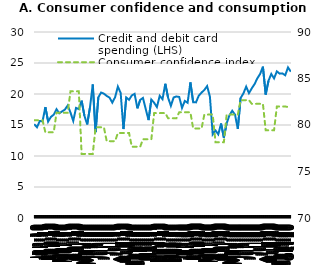
| Category | Credit and debit card spending (LHS) |
|---|---|
| 2019-01-04 | 15.138 |
| 2019-01-11 | 14.633 |
| 2019-01-18 | 15.64 |
| 2019-01-25 | 15.604 |
| 2019-02-01 | 17.898 |
| 2019-02-08 | 15.553 |
| 2019-02-15 | 16.305 |
| 2019-02-22 | 16.664 |
| 2019-03-01 | 17.551 |
| 2019-03-08 | 16.892 |
| 2019-03-15 | 17.191 |
| 2019-03-22 | 17.485 |
| 2019-03-29 | 18.14 |
| 2019-04-05 | 17.017 |
| 2019-04-12 | 15.656 |
| 2019-04-19 | 17.755 |
| 2019-04-26 | 17.567 |
| 2019-05-03 | 18.926 |
| 2019-05-10 | 16.505 |
| 2019-05-17 | 15.093 |
| 2019-05-24 | 17.843 |
| 2019-05-31 | 21.543 |
| 2019-06-07 | 13.849 |
| 2019-06-14 | 19.471 |
| 2019-06-21 | 20.238 |
| 2019-06-28 | 20.05 |
| 2019-07-05 | 19.69 |
| 2019-07-12 | 19.422 |
| 2019-07-19 | 18.61 |
| 2019-07-26 | 19.473 |
| 2019-08-02 | 21.196 |
| 2019-08-09 | 20.164 |
| 2019-08-16 | 14.348 |
| 2019-08-23 | 19.438 |
| 2019-08-30 | 19.063 |
| 2019-09-06 | 19.771 |
| 2019-09-13 | 20.018 |
| 2019-09-20 | 17.69 |
| 2019-09-27 | 19.044 |
| 2019-10-04 | 19.368 |
| 2019-10-11 | 17.548 |
| 2019-10-18 | 15.789 |
| 2019-10-25 | 19.097 |
| 2019-11-01 | 18.584 |
| 2019-11-08 | 17.895 |
| 2019-11-15 | 19.706 |
| 2019-11-22 | 19.162 |
| 2019-11-29 | 21.65 |
| 2019-12-06 | 19.408 |
| 2019-12-13 | 18.093 |
| 2019-12-20 | 19.447 |
| 2019-12-27 | 19.601 |
| 2020-01-03 | 19.516 |
| 2020-01-10 | 17.752 |
| 2020-01-17 | 18.883 |
| 2020-01-24 | 18.589 |
| 2020-01-31 | 21.869 |
| 2020-02-07 | 18.674 |
| 2020-02-14 | 18.65 |
| 2020-02-21 | 19.723 |
| 2020-02-28 | 20.231 |
| 2020-03-06 | 20.65 |
| 2020-03-13 | 21.272 |
| 2020-03-20 | 19.569 |
| 2020-03-27 | 13.498 |
| 2020-04-03 | 14.123 |
| 2020-04-10 | 13.489 |
| 2020-04-17 | 15.236 |
| 2020-04-24 | 12.966 |
| 2020-05-01 | 15.263 |
| 2020-05-08 | 16.559 |
| 2020-05-15 | 17.297 |
| 2020-05-22 | 16.672 |
| 2020-05-29 | 14.365 |
| 2020-06-05 | 19.349 |
| 2020-06-12 | 20.088 |
| 2020-06-19 | 21.188 |
| 2020-06-26 | 20.137 |
| 2020-07-03 | 20.908 |
| 2020-07-10 | 21.585 |
| 2020-07-17 | 22.525 |
| 2020-07-24 | 23.232 |
| 2020-07-31 | 24.409 |
| 2020-08-07 | 19.909 |
| 2020-08-14 | 22.133 |
| 2020-08-21 | 23.233 |
| 2020-08-28 | 22.51 |
| 2020-09-04 | 23.65 |
| 2020-09-11 | 23.283 |
| 2020-09-18 | 23.324 |
| 2020-09-25 | 23.02 |
| 2020-10-02 | 24.292 |
| 2020-10-09 | 23.597 |